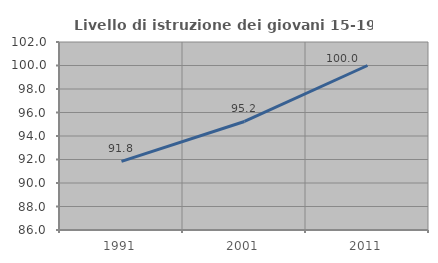
| Category | Livello di istruzione dei giovani 15-19 anni |
|---|---|
| 1991.0 | 91.837 |
| 2001.0 | 95.238 |
| 2011.0 | 100 |